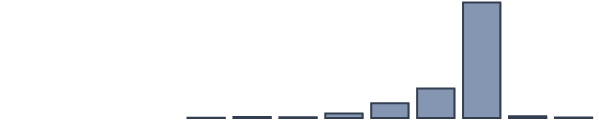
| Category | Series 0 |
|---|---|
| 0 | 0 |
| 1 | 0 |
| 2 | 0 |
| 3 | 0 |
| 4 | 0.2 |
| 5 | 0.6 |
| 6 | 0.5 |
| 7 | 2.7 |
| 8 | 8.7 |
| 9 | 17.5 |
| 10 | 68.5 |
| 11 | 1 |
| 12 | 0.3 |